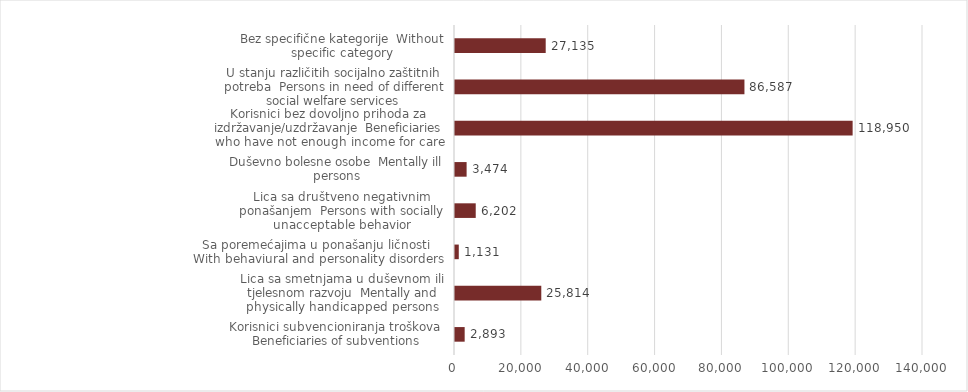
| Category | Series 7 |
|---|---|
| Korisnici subvencioniranja troškova  Beneficiaries of subventions | 2893 |
| Lica sa smetnjama u duševnom ili tjelesnom razvoju  Mentally and physically handicapped persons | 25814 |
| Sa poremećajima u ponašanju ličnosti  With behaviural and personality disorders | 1131 |
| Lica sa društveno negativnim ponašanjem  Persons with socially unacceptable behavior | 6202 |
| Duševno bolesne osobe  Mentally ill persons | 3474 |
| Korisnici bez dovoljno prihoda za izdržavanje/uzdržavanje  Beneficiaries who have not enough income for care | 118950 |
| U stanju različitih socijalno zaštitnih potreba  Persons in need of different social welfare services | 86587 |
| Bez specifične kategorije  Without specific category | 27135 |